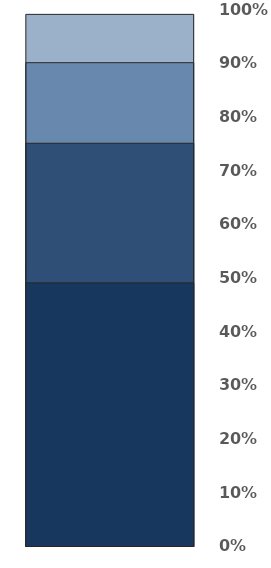
| Category | GOLD:  | SILVER: | CERTIFIED: | NEARLY THERE! |
|---|---|---|---|---|
| 0 | 0.99 | 0.9 | 0.75 | 0.49 |